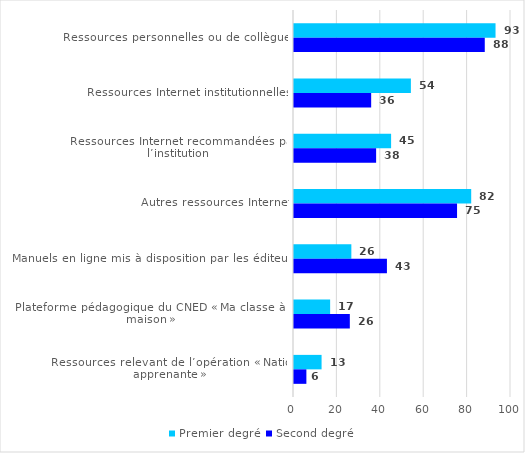
| Category | Premier degré | Second degré |
|---|---|---|
| Ressources personnelles ou de collègues | 92.872 | 87.911 |
| Ressources Internet institutionnelles | 53.866 | 35.564 |
| Ressources Internet recommandées par l’institution | 44.747 | 37.846 |
| Autres ressources Internet | 81.662 | 75.14 |
| Manuels en ligne mis à disposition par les éditeurs | 26.431 | 42.826 |
| Plateforme pédagogique du CNED « Ma classe à la maison » | 16.654 | 25.727 |
| Ressources relevant de l’opération « Nation apprenante » | 12.709 | 5.706 |